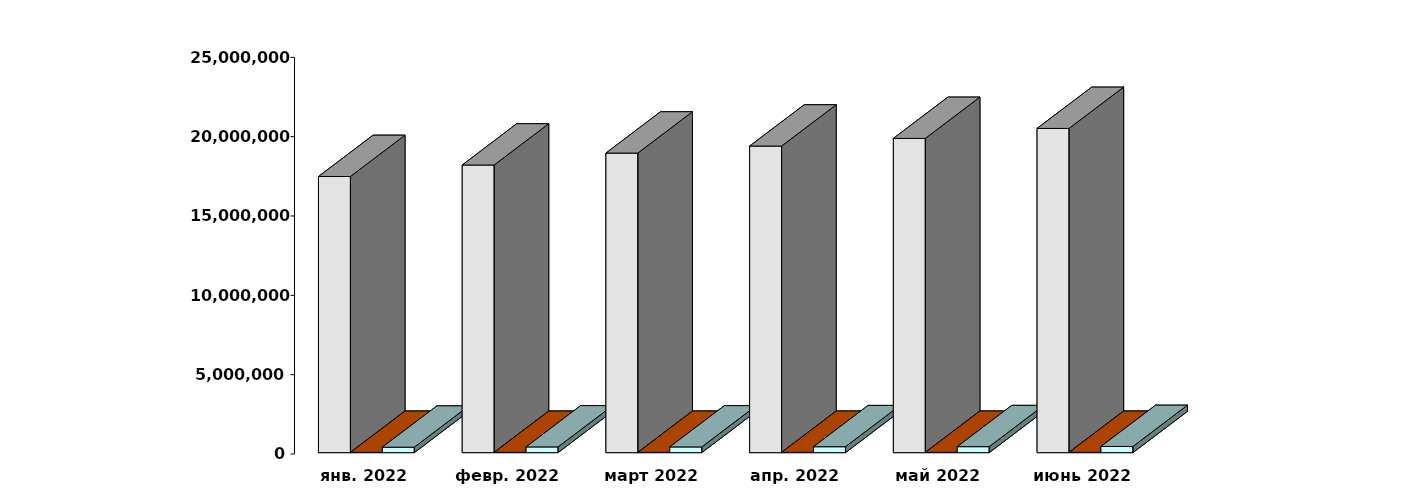
| Category | Физические лица | Юридические лица | Клиенты, передавшие свои средства в ДУ |
|---|---|---|---|
| 2022-01-28 | 17405817 | 20536 | 345411 |
| 2022-02-28 | 18128529 | 20698 | 361205 |
| 2022-03-30 | 18881687 | 21131 | 360205 |
| 2022-04-30 | 19323213 | 21524 | 374023 |
| 2022-05-30 | 19805248 | 21686 | 377979 |
| 2022-06-30 | 20434402 | 21881 | 390501 |